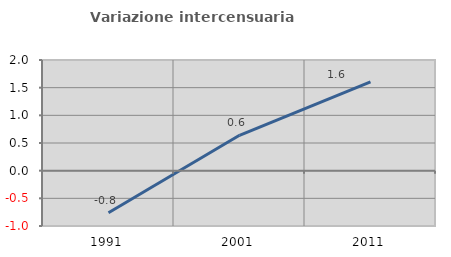
| Category | Variazione intercensuaria annua |
|---|---|
| 1991.0 | -0.76 |
| 2001.0 | 0.64 |
| 2011.0 | 1.606 |